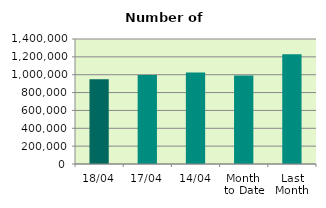
| Category | Series 0 |
|---|---|
| 18/04 | 948610 |
| 17/04 | 995456 |
| 14/04 | 1024692 |
| Month 
to Date | 992512.2 |
| Last
Month | 1228285.652 |